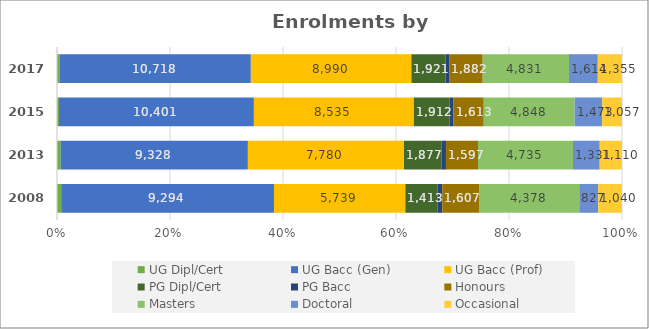
| Category | UG Dipl/Cert | UG Bacc (Gen) | UG Bacc (Prof) | PG Dipl/Cert | PG Bacc | Honours | Masters | Doctoral | Occasional |
|---|---|---|---|---|---|---|---|---|---|
| 2008 | 186 | 9294 | 5739 | 1413 | 200 | 1607 | 4378 | 827 | 1040 |
| 2013 | 185 | 9328 | 7780 | 1877 | 213 | 1597 | 4735 | 1331 | 1110 |
| 2015 | 106 | 10401 | 8535 | 1912 | 205 | 1613 | 4848 | 1473 | 1057 |
| 2017 | 136 | 10718 | 8990 | 1921 | 192 | 1882 | 4831 | 1614 | 1355 |